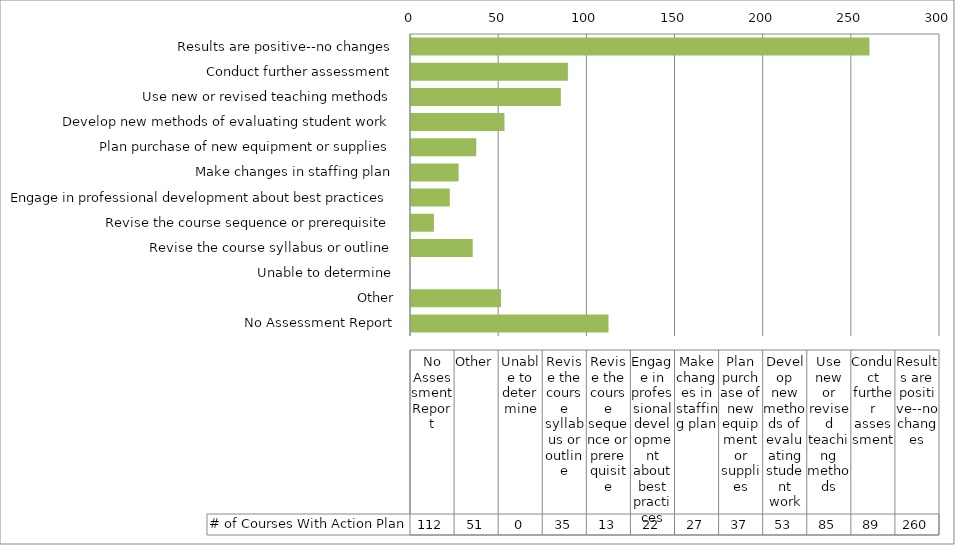
| Category | # of Courses With Action Plan |
|---|---|
| Results are positive--no changes | 260 |
| Conduct further assessment | 89 |
| Use new or revised teaching methods | 85 |
| Develop new methods of evaluating student work | 53 |
| Plan purchase of new equipment or supplies | 37 |
| Make changes in staffing plan | 27 |
| Engage in professional development about best practices | 22 |
| Revise the course sequence or prerequisite | 13 |
| Revise the course syllabus or outline | 35 |
| Unable to determine | 0 |
| Other | 51 |
| No Assessment Report | 112 |